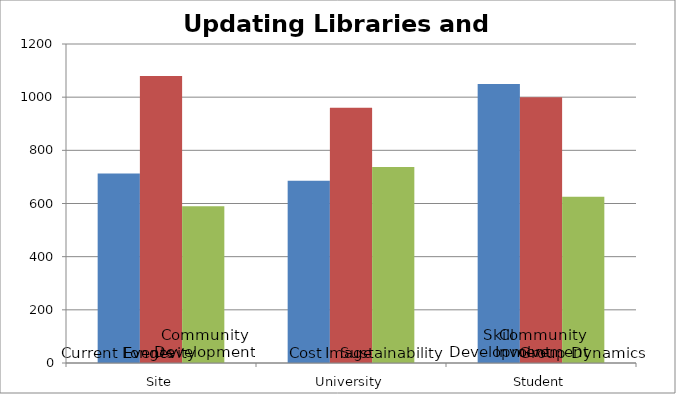
| Category | Alignment1 | Alignment2 | Alignment3 |
|---|---|---|---|
| 0 | 712.5 | 1080 | 590 |
| 1 | 686 | 960 | 737.5 |
| 2 | 1050 | 1000 | 625 |